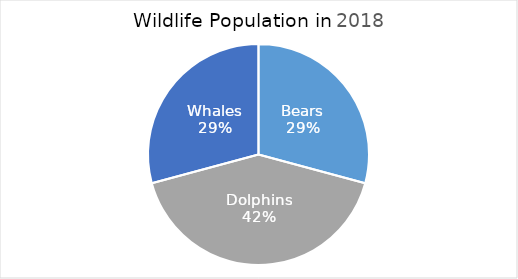
| Category | 2018 |
|---|---|
| Bears | 54 |
| Dolphins | 77 |
| Whales | 54 |